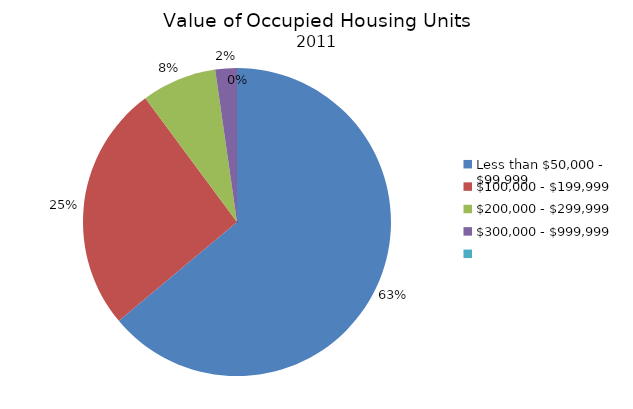
| Category | Series 0 |
|---|---|
| Less than $50,000 - $99,999 | 0.628 |
| $100,000 - $199,999 | 0.255 |
| $200,000 - $299,999 | 0.077 |
| $300,000 - $999,999 | 0.022 |